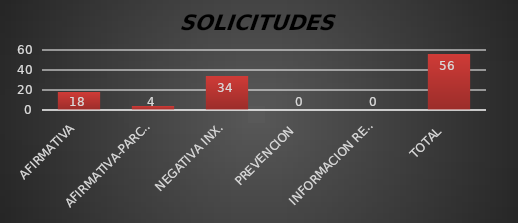
| Category | Series 1 |
|---|---|
| AFIRMATIVA | 18 |
| AFIRMATIVA-PARCIAL | 4 |
| NEGATIVA INX. | 34 |
| PREVENCION  | 0 |
| INFORMACION RESERVADA | 0 |
| TOTAL  | 56 |